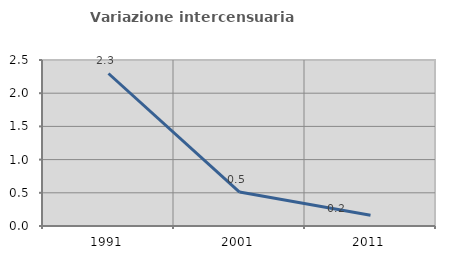
| Category | Variazione intercensuaria annua |
|---|---|
| 1991.0 | 2.297 |
| 2001.0 | 0.512 |
| 2011.0 | 0.161 |